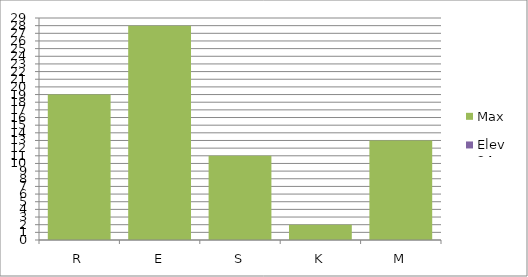
| Category | Max | Elev 24 |
|---|---|---|
| R | 19 | 0 |
| E | 28 | 0 |
| S | 11 | 0 |
| K | 2 | 0 |
| M | 13 | 0 |